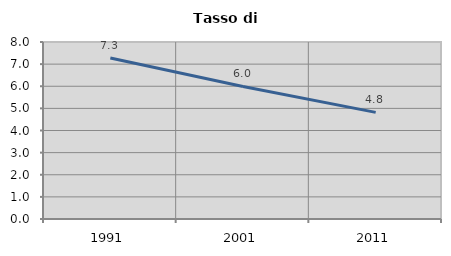
| Category | Tasso di disoccupazione   |
|---|---|
| 1991.0 | 7.28 |
| 2001.0 | 5.989 |
| 2011.0 | 4.819 |